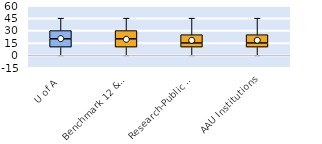
| Category | 25th | 50th | 75th |
|---|---|---|---|
| U of A | 10 | 10 | 10 |
| Benchmark 12 & SEC | 10 | 10 | 10 |
| Research-Public Univ | 10 | 5 | 10 |
| AAU Institutions | 10 | 5 | 10 |